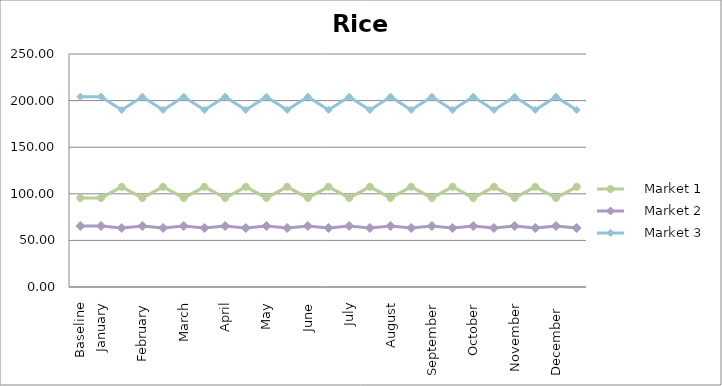
| Category |     Market 1 |     Market 2 |     Market 3 |
|---|---|---|---|
| Baseline | 95.556 | 65.444 | 204.222 |
| January | 95.556 | 65.444 | 204.222 |
|  | 107.5 | 63.333 | 190 |
| February | 95.556 | 65.444 | 204.222 |
|  | 107.5 | 63.333 | 190 |
| March | 95.556 | 65.444 | 204.222 |
|  | 107.5 | 63.333 | 190 |
| April | 95.556 | 65.444 | 204.222 |
|  | 107.5 | 63.333 | 190 |
| May | 95.556 | 65.444 | 204.222 |
|  | 107.5 | 63.333 | 190 |
| June | 95.556 | 65.444 | 204.222 |
|  | 107.5 | 63.333 | 190 |
| July | 95.556 | 65.444 | 204.222 |
|  | 107.5 | 63.333 | 190 |
| August | 95.556 | 65.444 | 204.222 |
|  | 107.5 | 63.333 | 190 |
| September | 95.556 | 65.444 | 204.222 |
|  | 107.5 | 63.333 | 190 |
| October | 95.556 | 65.444 | 204.222 |
|  | 107.5 | 63.333 | 190 |
| November | 95.556 | 65.444 | 204.222 |
|  | 107.5 | 63.333 | 190 |
| December  | 95.556 | 65.444 | 204.222 |